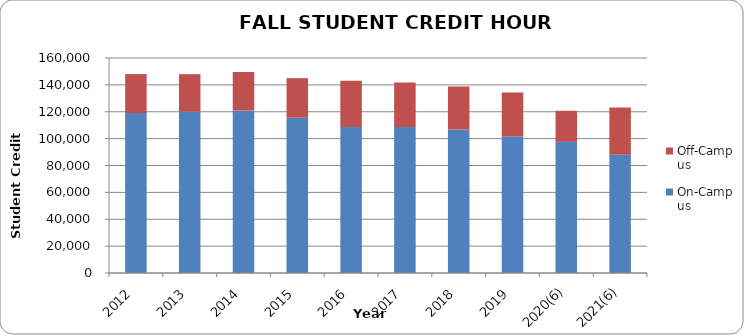
| Category | On-Campus | Off-Campus |
|---|---|---|
| 2012 | 119047 | 28972 |
| 2013 | 120113 | 27854 |
| 2014 | 120922 | 28672 |
| 2015 | 115555 | 29445 |
| 2016 | 108619 | 34509 |
| 2017 | 108606 | 33231 |
| 2018 | 106750 | 32097 |
| 2019 | 101574 | 32844 |
| 2020(6) | 97594 | 23109 |
| 2021(6) | 88013 | 35143 |